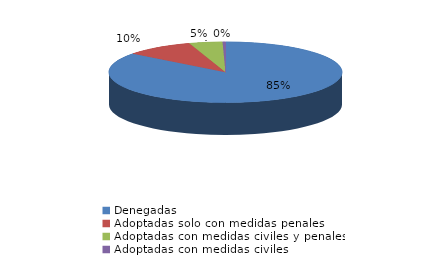
| Category | Series 0 |
|---|---|
| Denegadas | 427 |
| Adoptadas solo con medidas penales | 48 |
| Adoptadas con medidas civiles y penales | 23 |
| Adoptadas con medidas civiles | 2 |